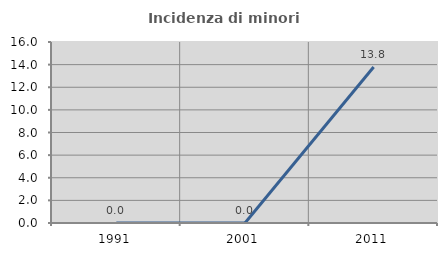
| Category | Incidenza di minori stranieri |
|---|---|
| 1991.0 | 0 |
| 2001.0 | 0 |
| 2011.0 | 13.793 |